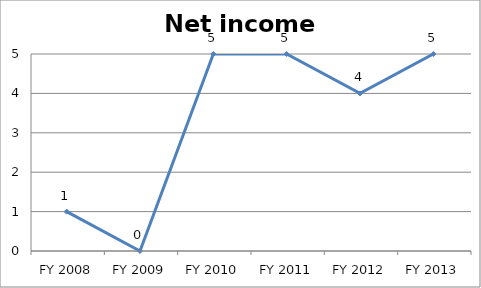
| Category | Net income score |
|---|---|
| FY 2013 | 5 |
| FY 2012 | 4 |
| FY 2011 | 5 |
| FY 2010 | 5 |
| FY 2009 | 0 |
| FY 2008 | 1 |